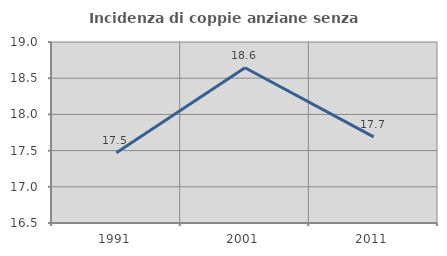
| Category | Incidenza di coppie anziane senza figli  |
|---|---|
| 1991.0 | 17.471 |
| 2001.0 | 18.644 |
| 2011.0 | 17.69 |